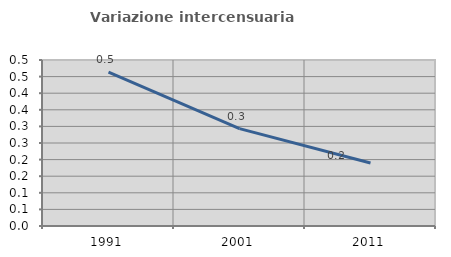
| Category | Variazione intercensuaria annua |
|---|---|
| 1991.0 | 0.463 |
| 2001.0 | 0.293 |
| 2011.0 | 0.19 |